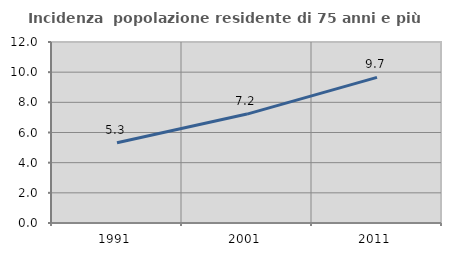
| Category | Incidenza  popolazione residente di 75 anni e più |
|---|---|
| 1991.0 | 5.318 |
| 2001.0 | 7.222 |
| 2011.0 | 9.653 |